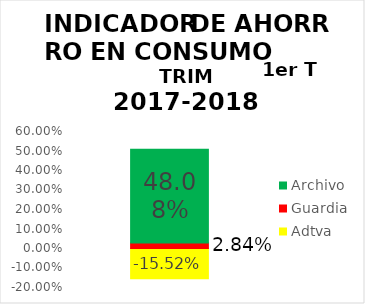
| Category | Adtva | Guardia | Archivo |
|---|---|---|---|
| 0 | -0.155 | 0.028 | 0.481 |